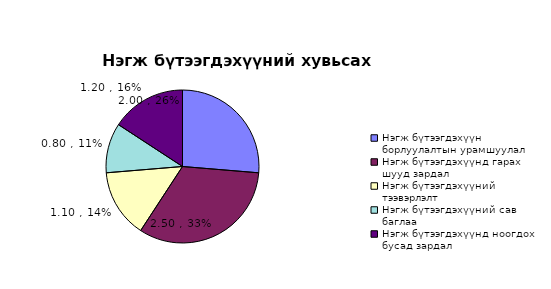
| Category | Series 0 |
|---|---|
| Нэгж бүтээгдэхүүн борлуулалтын урамшуулал | 2 |
| Нэгж бүтээгдэхүүнд гарах шууд зардал | 2.5 |
| Нэгж бүтээгдэхүүний тээвэрлэлт | 1.1 |
| Нэгж бүтээгдэхүүний сав баглаа | 0.8 |
| Нэгж бүтээгдэхүүнд ноогдох бусад зардал | 1.2 |